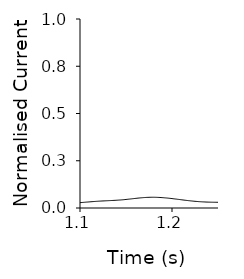
| Category | No Ammonium pH 8 in pH 5 out |
|---|---|
| 0.0 | 0.031 |
| 0.001 | 0.031 |
| 0.002 | 0.031 |
| 0.003 | 0.031 |
| 0.004 | 0.032 |
| 0.005 | 0.032 |
| 0.006 | 0.032 |
| 0.007 | 0.033 |
| 0.008 | 0.034 |
| 0.009 | 0.034 |
| 0.01 | 0.035 |
| 0.011 | 0.036 |
| 0.012 | 0.037 |
| 0.013 | 0.039 |
| 0.014 | 0.04 |
| 0.015 | 0.041 |
| 0.016 | 0.043 |
| 0.017 | 0.045 |
| 0.018 | 0.047 |
| 0.019 | 0.049 |
| 0.02 | 0.052 |
| 0.021 | 0.055 |
| 0.022 | 0.059 |
| 0.023 | 0.063 |
| 0.024 | 0.067 |
| 0.025 | 0.072 |
| 0.026 | 0.077 |
| 0.027 | 0.083 |
| 0.028 | 0.089 |
| 0.029 | 0.095 |
| 0.03 | 0.103 |
| 0.031 | 0.11 |
| 0.032 | 0.118 |
| 0.033 | 0.126 |
| 0.034 | 0.135 |
| 0.035 | 0.144 |
| 0.036 | 0.154 |
| 0.037 | 0.164 |
| 0.038 | 0.175 |
| 0.039 | 0.186 |
| 0.04 | 0.197 |
| 0.041 | 0.209 |
| 0.042 | 0.221 |
| 0.043 | 0.233 |
| 0.044 | 0.246 |
| 0.045 | 0.259 |
| 0.046 | 0.272 |
| 0.047 | 0.286 |
| 0.048 | 0.3 |
| 0.049 | 0.314 |
| 0.05 | 0.328 |
| 0.051 | 0.342 |
| 0.052 | 0.356 |
| 0.053 | 0.371 |
| 0.054 | 0.385 |
| 0.055 | 0.399 |
| 0.056 | 0.413 |
| 0.057 | 0.427 |
| 0.058 | 0.441 |
| 0.059 | 0.454 |
| 0.06 | 0.467 |
| 0.061 | 0.48 |
| 0.062 | 0.492 |
| 0.063 | 0.504 |
| 0.064 | 0.515 |
| 0.065 | 0.526 |
| 0.066 | 0.536 |
| 0.067 | 0.546 |
| 0.068 | 0.555 |
| 0.069 | 0.564 |
| 0.07 | 0.572 |
| 0.071 | 0.579 |
| 0.072 | 0.586 |
| 0.073 | 0.592 |
| 0.074 | 0.597 |
| 0.075 | 0.602 |
| 0.076 | 0.606 |
| 0.077 | 0.609 |
| 0.078 | 0.611 |
| 0.079 | 0.613 |
| 0.08 | 0.614 |
| 0.081 | 0.615 |
| 0.082 | 0.614 |
| 0.083 | 0.613 |
| 0.084 | 0.611 |
| 0.085 | 0.609 |
| 0.086 | 0.606 |
| 0.087 | 0.603 |
| 0.088 | 0.598 |
| 0.089 | 0.594 |
| 0.09 | 0.588 |
| 0.091 | 0.582 |
| 0.092 | 0.576 |
| 0.093 | 0.569 |
| 0.094 | 0.562 |
| 0.095 | 0.554 |
| 0.096 | 0.546 |
| 0.097 | 0.537 |
| 0.098 | 0.528 |
| 0.099 | 0.519 |
| 0.1 | 0.509 |
| 0.101 | 0.499 |
| 0.102 | 0.489 |
| 0.103 | 0.479 |
| 0.104 | 0.468 |
| 0.105 | 0.458 |
| 0.106 | 0.447 |
| 0.107 | 0.436 |
| 0.108 | 0.425 |
| 0.109 | 0.414 |
| 0.11 | 0.403 |
| 0.111 | 0.391 |
| 0.112 | 0.38 |
| 0.113 | 0.369 |
| 0.114 | 0.358 |
| 0.115 | 0.347 |
| 0.116 | 0.335 |
| 0.117 | 0.324 |
| 0.118 | 0.314 |
| 0.119 | 0.303 |
| 0.12 | 0.292 |
| 0.121 | 0.282 |
| 0.122 | 0.271 |
| 0.123 | 0.261 |
| 0.124 | 0.251 |
| 0.125 | 0.241 |
| 0.126 | 0.232 |
| 0.127 | 0.222 |
| 0.128 | 0.213 |
| 0.129 | 0.204 |
| 0.13 | 0.195 |
| 0.131 | 0.187 |
| 0.132 | 0.178 |
| 0.133 | 0.17 |
| 0.134 | 0.162 |
| 0.135 | 0.155 |
| 0.136 | 0.147 |
| 0.137 | 0.14 |
| 0.138 | 0.133 |
| 0.139 | 0.127 |
| 0.14 | 0.12 |
| 0.141 | 0.114 |
| 0.142 | 0.108 |
| 0.143 | 0.103 |
| 0.144 | 0.097 |
| 0.145 | 0.092 |
| 0.146 | 0.087 |
| 0.147 | 0.082 |
| 0.148 | 0.078 |
| 0.149 | 0.073 |
| 0.15 | 0.069 |
| 0.151 | 0.065 |
| 0.152 | 0.061 |
| 0.153 | 0.058 |
| 0.154 | 0.055 |
| 0.155 | 0.051 |
| 0.156 | 0.048 |
| 0.157 | 0.046 |
| 0.158 | 0.043 |
| 0.159 | 0.04 |
| 0.16 | 0.038 |
| 0.161 | 0.036 |
| 0.162 | 0.034 |
| 0.163 | 0.032 |
| 0.164 | 0.03 |
| 0.165 | 0.028 |
| 0.166 | 0.027 |
| 0.167 | 0.025 |
| 0.168 | 0.024 |
| 0.169 | 0.022 |
| 0.17 | 0.021 |
| 0.171 | 0.02 |
| 0.172 | 0.019 |
| 0.173 | 0.018 |
| 0.174 | 0.017 |
| 0.175 | 0.016 |
| 0.176 | 0.015 |
| 0.177 | 0.015 |
| 0.178 | 0.014 |
| 0.179 | 0.013 |
| 0.18 | 0.013 |
| 0.181 | 0.012 |
| 0.182 | 0.012 |
| 0.183 | 0.011 |
| 0.184 | 0.011 |
| 0.185 | 0.01 |
| 0.186 | 0.01 |
| 0.187 | 0.009 |
| 0.188 | 0.009 |
| 0.189 | 0.009 |
| 0.19 | 0.008 |
| 0.191 | 0.008 |
| 0.192 | 0.008 |
| 0.193 | 0.007 |
| 0.194 | 0.007 |
| 0.195 | 0.007 |
| 0.196 | 0.006 |
| 0.197 | 0.006 |
| 0.198 | 0.006 |
| 0.199 | 0.006 |
| 0.2 | 0.005 |
| 0.201 | 0.005 |
| 0.202 | 0.005 |
| 0.203 | 0.005 |
| 0.204 | 0.004 |
| 0.205 | 0.004 |
| 0.206 | 0.004 |
| 0.207 | 0.004 |
| 0.208 | 0.003 |
| 0.209 | 0.003 |
| 0.21 | 0.003 |
| 0.211 | 0.003 |
| 0.212 | 0.003 |
| 0.213 | 0.003 |
| 0.214 | 0.002 |
| 0.215 | 0.002 |
| 0.216 | 0.002 |
| 0.217 | 0.002 |
| 0.218 | 0.002 |
| 0.219 | 0.002 |
| 0.22 | 0.001 |
| 0.221 | 0.001 |
| 0.222 | 0.001 |
| 0.223 | 0.001 |
| 0.224 | 0.001 |
| 0.225 | 0.001 |
| 0.226 | 0.001 |
| 0.227 | 0.001 |
| 0.228 | 0.001 |
| 0.229 | 0.001 |
| 0.23 | 0.001 |
| 0.231 | 0.001 |
| 0.232 | 0.001 |
| 0.233 | 0 |
| 0.234 | 0 |
| 0.235 | 0 |
| 0.236 | 0 |
| 0.237 | 0 |
| 0.238 | 0.001 |
| 0.239 | 0.001 |
| 0.24 | 0.001 |
| 0.241 | 0.001 |
| 0.242 | 0.001 |
| 0.243 | 0.001 |
| 0.244 | 0.001 |
| 0.245 | 0.001 |
| 0.246 | 0.001 |
| 0.247 | 0.001 |
| 0.248 | 0.001 |
| 0.249 | 0.001 |
| 0.25 | 0.001 |
| 0.251 | 0.001 |
| 0.252 | 0.001 |
| 0.253 | 0.001 |
| 0.254 | 0.001 |
| 0.255 | 0.001 |
| 0.256 | 0.001 |
| 0.257 | 0.001 |
| 0.258 | 0.001 |
| 0.259 | 0.001 |
| 0.26 | 0.001 |
| 0.261 | 0.001 |
| 0.262 | 0.001 |
| 0.263 | 0.001 |
| 0.264 | 0.001 |
| 0.265 | 0.001 |
| 0.266 | 0.001 |
| 0.267 | 0.001 |
| 0.268 | 0.001 |
| 0.269 | 0.001 |
| 0.27 | 0.001 |
| 0.271 | 0.001 |
| 0.272 | 0.001 |
| 0.273 | 0.001 |
| 0.274 | 0.001 |
| 0.275 | 0.001 |
| 0.276 | 0.001 |
| 0.277 | 0.001 |
| 0.278 | 0.001 |
| 0.279 | 0.001 |
| 0.28 | 0.001 |
| 0.281 | 0.001 |
| 0.282 | 0.001 |
| 0.283 | 0.001 |
| 0.284 | 0.001 |
| 0.285 | 0.001 |
| 0.286 | 0.001 |
| 0.287 | 0.001 |
| 0.288 | 0.001 |
| 0.289 | 0.001 |
| 0.29 | 0.001 |
| 0.291 | 0.001 |
| 0.292 | 0.001 |
| 0.293 | 0.001 |
| 0.294 | 0.001 |
| 0.295 | 0.001 |
| 0.296 | 0.001 |
| 0.297 | 0.001 |
| 0.298 | 0.001 |
| 0.299 | 0.001 |
| 0.3 | 0.002 |
| 0.301 | 0.002 |
| 0.302 | 0.002 |
| 0.303 | 0.002 |
| 0.304 | 0.002 |
| 0.305 | 0.002 |
| 0.306 | 0.002 |
| 0.307 | 0.003 |
| 0.308 | 0.003 |
| 0.309 | 0.003 |
| 0.31 | 0.003 |
| 0.311 | 0.003 |
| 0.312 | 0.003 |
| 0.313 | 0.003 |
| 0.314 | 0.002 |
| 0.315 | 0.002 |
| 0.316 | 0 |
| 0.317 | -0.003 |
| 0.318 | -0.006 |
| 0.319 | -0.012 |
| 0.32 | -0.019 |
| 0.321 | -0.031 |
| 0.322 | -0.046 |
| 0.323 | -0.067 |
| 0.324 | -0.093 |
| 0.325 | -0.124 |
| 0.326 | -0.161 |
| 0.327 | -0.203 |
| 0.328 | -0.249 |
| 0.329 | -0.3 |
| 0.33 | -0.355 |
| 0.331 | -0.413 |
| 0.332 | -0.474 |
| 0.333 | -0.537 |
| 0.334 | -0.602 |
| 0.335 | -0.669 |
| 0.336 | -0.737 |
| 0.337 | -0.805 |
| 0.338 | -0.873 |
| 0.339 | -0.941 |
| 0.34 | -1.008 |
| 0.341 | -1.074 |
| 0.342 | -1.138 |
| 0.343 | -1.201 |
| 0.344 | -1.261 |
| 0.345 | -1.319 |
| 0.346 | -1.374 |
| 0.347 | -1.426 |
| 0.348 | -1.475 |
| 0.349 | -1.52 |
| 0.35 | -1.562 |
| 0.351 | -1.6 |
| 0.352 | -1.633 |
| 0.353 | -1.663 |
| 0.354 | -1.688 |
| 0.355 | -1.708 |
| 0.356 | -1.724 |
| 0.357 | -1.736 |
| 0.358 | -1.743 |
| 0.359 | -1.745 |
| 0.36 | -1.743 |
| 0.361 | -1.736 |
| 0.362 | -1.726 |
| 0.363 | -1.711 |
| 0.364 | -1.693 |
| 0.365 | -1.67 |
| 0.366 | -1.645 |
| 0.367 | -1.616 |
| 0.368 | -1.583 |
| 0.369 | -1.548 |
| 0.37 | -1.511 |
| 0.371 | -1.47 |
| 0.372 | -1.428 |
| 0.373 | -1.384 |
| 0.374 | -1.338 |
| 0.375 | -1.291 |
| 0.376 | -1.242 |
| 0.377 | -1.192 |
| 0.378 | -1.142 |
| 0.379 | -1.091 |
| 0.38 | -1.04 |
| 0.381 | -0.988 |
| 0.382 | -0.936 |
| 0.383 | -0.885 |
| 0.384 | -0.834 |
| 0.385 | -0.783 |
| 0.386 | -0.732 |
| 0.387 | -0.683 |
| 0.388 | -0.634 |
| 0.389 | -0.586 |
| 0.39 | -0.539 |
| 0.391 | -0.493 |
| 0.392 | -0.448 |
| 0.393 | -0.405 |
| 0.394 | -0.363 |
| 0.395 | -0.323 |
| 0.396 | -0.284 |
| 0.397 | -0.246 |
| 0.398 | -0.21 |
| 0.399 | -0.176 |
| 0.4 | -0.143 |
| 0.401 | -0.112 |
| 0.402 | -0.082 |
| 0.403 | -0.054 |
| 0.404 | -0.028 |
| 0.405 | -0.004 |
| 0.406 | 0.019 |
| 0.407 | 0.04 |
| 0.408 | 0.059 |
| 0.409 | 0.077 |
| 0.41 | 0.093 |
| 0.411 | 0.108 |
| 0.412 | 0.122 |
| 0.413 | 0.134 |
| 0.414 | 0.144 |
| 0.415 | 0.154 |
| 0.416 | 0.162 |
| 0.417 | 0.169 |
| 0.418 | 0.176 |
| 0.419 | 0.181 |
| 0.42 | 0.185 |
| 0.421 | 0.189 |
| 0.422 | 0.191 |
| 0.423 | 0.193 |
| 0.424 | 0.194 |
| 0.425 | 0.195 |
| 0.426 | 0.195 |
| 0.427 | 0.194 |
| 0.428 | 0.193 |
| 0.429 | 0.192 |
| 0.43 | 0.19 |
| 0.431 | 0.188 |
| 0.432 | 0.185 |
| 0.433 | 0.183 |
| 0.434 | 0.18 |
| 0.435 | 0.177 |
| 0.436 | 0.175 |
| 0.437 | 0.172 |
| 0.438 | 0.169 |
| 0.439 | 0.167 |
| 0.44 | 0.165 |
| 0.441 | 0.163 |
| 0.442 | 0.161 |
| 0.443 | 0.159 |
| 0.444 | 0.158 |
| 0.445 | 0.157 |
| 0.446 | 0.156 |
| 0.447 | 0.155 |
| 0.448 | 0.154 |
| 0.449 | 0.154 |
| 0.45 | 0.154 |
| 0.451 | 0.154 |
| 0.452 | 0.154 |
| 0.453 | 0.154 |
| 0.454 | 0.155 |
| 0.455 | 0.155 |
| 0.456 | 0.156 |
| 0.457 | 0.157 |
| 0.458 | 0.158 |
| 0.459 | 0.159 |
| 0.46 | 0.16 |
| 0.461 | 0.162 |
| 0.462 | 0.163 |
| 0.463 | 0.164 |
| 0.464 | 0.165 |
| 0.465 | 0.166 |
| 0.466 | 0.167 |
| 0.467 | 0.169 |
| 0.468 | 0.17 |
| 0.469 | 0.171 |
| 0.47 | 0.172 |
| 0.471 | 0.173 |
| 0.472 | 0.174 |
| 0.473 | 0.175 |
| 0.474 | 0.176 |
| 0.475 | 0.177 |
| 0.476 | 0.178 |
| 0.477 | 0.179 |
| 0.478 | 0.18 |
| 0.479 | 0.181 |
| 0.48 | 0.182 |
| 0.481 | 0.184 |
| 0.482 | 0.185 |
| 0.483 | 0.186 |
| 0.484 | 0.187 |
| 0.485 | 0.189 |
| 0.486 | 0.19 |
| 0.487 | 0.191 |
| 0.488 | 0.192 |
| 0.489 | 0.194 |
| 0.49 | 0.195 |
| 0.491 | 0.196 |
| 0.492 | 0.198 |
| 0.493 | 0.199 |
| 0.494 | 0.2 |
| 0.495 | 0.201 |
| 0.496 | 0.202 |
| 0.497 | 0.203 |
| 0.498 | 0.204 |
| 0.499 | 0.205 |
| 0.5 | 0.206 |
| 0.501 | 0.207 |
| 0.502 | 0.208 |
| 0.503 | 0.208 |
| 0.504 | 0.209 |
| 0.505 | 0.21 |
| 0.506 | 0.21 |
| 0.507 | 0.211 |
| 0.508 | 0.211 |
| 0.509 | 0.211 |
| 0.51 | 0.211 |
| 0.511 | 0.212 |
| 0.512 | 0.212 |
| 0.513 | 0.212 |
| 0.514 | 0.212 |
| 0.515 | 0.212 |
| 0.516 | 0.212 |
| 0.517 | 0.211 |
| 0.518 | 0.211 |
| 0.519 | 0.211 |
| 0.52 | 0.211 |
| 0.521 | 0.21 |
| 0.522 | 0.21 |
| 0.523 | 0.209 |
| 0.524 | 0.209 |
| 0.525 | 0.208 |
| 0.526 | 0.208 |
| 0.527 | 0.207 |
| 0.528 | 0.206 |
| 0.529 | 0.206 |
| 0.53 | 0.205 |
| 0.531 | 0.204 |
| 0.532 | 0.203 |
| 0.533 | 0.203 |
| 0.534 | 0.202 |
| 0.535 | 0.201 |
| 0.536 | 0.2 |
| 0.537 | 0.199 |
| 0.538 | 0.198 |
| 0.539 | 0.197 |
| 0.54 | 0.196 |
| 0.541 | 0.195 |
| 0.542 | 0.194 |
| 0.543 | 0.193 |
| 0.544 | 0.192 |
| 0.545 | 0.191 |
| 0.546 | 0.19 |
| 0.547 | 0.189 |
| 0.548 | 0.188 |
| 0.549 | 0.187 |
| 0.55 | 0.185 |
| 0.551 | 0.184 |
| 0.552 | 0.183 |
| 0.553 | 0.182 |
| 0.554 | 0.181 |
| 0.555 | 0.18 |
| 0.556 | 0.179 |
| 0.557 | 0.178 |
| 0.558 | 0.177 |
| 0.559 | 0.176 |
| 0.56 | 0.175 |
| 0.561 | 0.174 |
| 0.562 | 0.173 |
| 0.563 | 0.172 |
| 0.564 | 0.171 |
| 0.565 | 0.17 |
| 0.566 | 0.17 |
| 0.567 | 0.169 |
| 0.568 | 0.168 |
| 0.569 | 0.167 |
| 0.57 | 0.166 |
| 0.571 | 0.165 |
| 0.572 | 0.165 |
| 0.573 | 0.164 |
| 0.574 | 0.163 |
| 0.575 | 0.162 |
| 0.576 | 0.162 |
| 0.577 | 0.161 |
| 0.578 | 0.16 |
| 0.579 | 0.159 |
| 0.58 | 0.159 |
| 0.581 | 0.158 |
| 0.582 | 0.157 |
| 0.583 | 0.157 |
| 0.584 | 0.156 |
| 0.585 | 0.155 |
| 0.586 | 0.155 |
| 0.587 | 0.154 |
| 0.588 | 0.153 |
| 0.589 | 0.153 |
| 0.59 | 0.152 |
| 0.591 | 0.151 |
| 0.592 | 0.151 |
| 0.593 | 0.15 |
| 0.594 | 0.149 |
| 0.595 | 0.149 |
| 0.596 | 0.148 |
| 0.597 | 0.147 |
| 0.598 | 0.147 |
| 0.599 | 0.146 |
| 0.6 | 0.145 |
| 0.601 | 0.145 |
| 0.602 | 0.144 |
| 0.603 | 0.143 |
| 0.604 | 0.143 |
| 0.605 | 0.142 |
| 0.606 | 0.141 |
| 0.607 | 0.141 |
| 0.608 | 0.14 |
| 0.609 | 0.139 |
| 0.61 | 0.138 |
| 0.611 | 0.138 |
| 0.612 | 0.137 |
| 0.613 | 0.136 |
| 0.614 | 0.135 |
| 0.615 | 0.135 |
| 0.616 | 0.134 |
| 0.617 | 0.133 |
| 0.618 | 0.132 |
| 0.619 | 0.131 |
| 0.62 | 0.131 |
| 0.621 | 0.13 |
| 0.622 | 0.129 |
| 0.623 | 0.128 |
| 0.624 | 0.127 |
| 0.625 | 0.126 |
| 0.626 | 0.126 |
| 0.627 | 0.125 |
| 0.628 | 0.124 |
| 0.629 | 0.123 |
| 0.63 | 0.122 |
| 0.631 | 0.121 |
| 0.632 | 0.121 |
| 0.633 | 0.12 |
| 0.634 | 0.119 |
| 0.635 | 0.118 |
| 0.636 | 0.117 |
| 0.637 | 0.116 |
| 0.638 | 0.115 |
| 0.639 | 0.115 |
| 0.64 | 0.114 |
| 0.641 | 0.113 |
| 0.642 | 0.112 |
| 0.643 | 0.111 |
| 0.644 | 0.11 |
| 0.645 | 0.11 |
| 0.646 | 0.109 |
| 0.647 | 0.108 |
| 0.648 | 0.107 |
| 0.649 | 0.106 |
| 0.65 | 0.106 |
| 0.651 | 0.105 |
| 0.652 | 0.104 |
| 0.653 | 0.103 |
| 0.654 | 0.102 |
| 0.655 | 0.102 |
| 0.656 | 0.101 |
| 0.657 | 0.1 |
| 0.658 | 0.099 |
| 0.659 | 0.099 |
| 0.66 | 0.098 |
| 0.661 | 0.097 |
| 0.662 | 0.096 |
| 0.663 | 0.096 |
| 0.664 | 0.095 |
| 0.665 | 0.094 |
| 0.666 | 0.094 |
| 0.667 | 0.093 |
| 0.668 | 0.092 |
| 0.669 | 0.092 |
| 0.67 | 0.091 |
| 0.671 | 0.09 |
| 0.672 | 0.09 |
| 0.673 | 0.089 |
| 0.674 | 0.089 |
| 0.675 | 0.088 |
| 0.676 | 0.088 |
| 0.677 | 0.087 |
| 0.678 | 0.086 |
| 0.679 | 0.086 |
| 0.68 | 0.085 |
| 0.681 | 0.085 |
| 0.682 | 0.084 |
| 0.683 | 0.084 |
| 0.684 | 0.084 |
| 0.685 | 0.083 |
| 0.686 | 0.083 |
| 0.687 | 0.082 |
| 0.688 | 0.082 |
| 0.689 | 0.081 |
| 0.69 | 0.081 |
| 0.691 | 0.081 |
| 0.692 | 0.08 |
| 0.693 | 0.08 |
| 0.694 | 0.079 |
| 0.695 | 0.079 |
| 0.696 | 0.079 |
| 0.697 | 0.078 |
| 0.698 | 0.078 |
| 0.699 | 0.078 |
| 0.7 | 0.077 |
| 0.701 | 0.077 |
| 0.702 | 0.076 |
| 0.703 | 0.076 |
| 0.704 | 0.076 |
| 0.705 | 0.075 |
| 0.706 | 0.075 |
| 0.707 | 0.074 |
| 0.708 | 0.074 |
| 0.709 | 0.074 |
| 0.71 | 0.073 |
| 0.711 | 0.073 |
| 0.712 | 0.072 |
| 0.713 | 0.072 |
| 0.714 | 0.071 |
| 0.715 | 0.071 |
| 0.716 | 0.07 |
| 0.717 | 0.07 |
| 0.718 | 0.069 |
| 0.719 | 0.069 |
| 0.72 | 0.068 |
| 0.721 | 0.068 |
| 0.722 | 0.067 |
| 0.723 | 0.067 |
| 0.724 | 0.066 |
| 0.725 | 0.066 |
| 0.726 | 0.065 |
| 0.727 | 0.064 |
| 0.728 | 0.064 |
| 0.729 | 0.063 |
| 0.73 | 0.063 |
| 0.731 | 0.062 |
| 0.732 | 0.062 |
| 0.733 | 0.061 |
| 0.734 | 0.06 |
| 0.735 | 0.06 |
| 0.736 | 0.059 |
| 0.737 | 0.059 |
| 0.738 | 0.058 |
| 0.739 | 0.057 |
| 0.74 | 0.057 |
| 0.741 | 0.056 |
| 0.742 | 0.055 |
| 0.743 | 0.055 |
| 0.744 | 0.054 |
| 0.745 | 0.054 |
| 0.746 | 0.053 |
| 0.747 | 0.052 |
| 0.748 | 0.052 |
| 0.749 | 0.051 |
| 0.75 | 0.05 |
| 0.751 | 0.05 |
| 0.752 | 0.049 |
| 0.753 | 0.049 |
| 0.754 | 0.048 |
| 0.755 | 0.047 |
| 0.756 | 0.047 |
| 0.757 | 0.046 |
| 0.758 | 0.046 |
| 0.759 | 0.045 |
| 0.76 | 0.045 |
| 0.761 | 0.044 |
| 0.762 | 0.044 |
| 0.763 | 0.043 |
| 0.764 | 0.043 |
| 0.765 | 0.042 |
| 0.766 | 0.042 |
| 0.767 | 0.041 |
| 0.768 | 0.041 |
| 0.769 | 0.04 |
| 0.77 | 0.04 |
| 0.771 | 0.039 |
| 0.772 | 0.039 |
| 0.773 | 0.038 |
| 0.774 | 0.038 |
| 0.775 | 0.037 |
| 0.776 | 0.037 |
| 0.777 | 0.037 |
| 0.778 | 0.036 |
| 0.779 | 0.036 |
| 0.78 | 0.035 |
| 0.781 | 0.035 |
| 0.782 | 0.035 |
| 0.783 | 0.034 |
| 0.784 | 0.034 |
| 0.785 | 0.034 |
| 0.786 | 0.033 |
| 0.787 | 0.033 |
| 0.788 | 0.033 |
| 0.789 | 0.032 |
| 0.79 | 0.032 |
| 0.791 | 0.032 |
| 0.792 | 0.031 |
| 0.793 | 0.031 |
| 0.794 | 0.031 |
| 0.795 | 0.03 |
| 0.796 | 0.03 |
| 0.797 | 0.03 |
| 0.798 | 0.03 |
| 0.799 | 0.029 |
| 0.8 | 0.029 |
| 0.801 | 0.029 |
| 0.802 | 0.029 |
| 0.803 | 0.028 |
| 0.804 | 0.028 |
| 0.805 | 0.028 |
| 0.806 | 0.028 |
| 0.807 | 0.028 |
| 0.808 | 0.027 |
| 0.809 | 0.027 |
| 0.81 | 0.027 |
| 0.811 | 0.027 |
| 0.812 | 0.027 |
| 0.813 | 0.027 |
| 0.814 | 0.026 |
| 0.815 | 0.026 |
| 0.816 | 0.026 |
| 0.817 | 0.026 |
| 0.818 | 0.026 |
| 0.819 | 0.026 |
| 0.82 | 0.026 |
| 0.821 | 0.025 |
| 0.822 | 0.025 |
| 0.823 | 0.025 |
| 0.824 | 0.025 |
| 0.825 | 0.025 |
| 0.826 | 0.025 |
| 0.827 | 0.025 |
| 0.828 | 0.025 |
| 0.829 | 0.025 |
| 0.83 | 0.024 |
| 0.831 | 0.024 |
| 0.832 | 0.024 |
| 0.833 | 0.024 |
| 0.834 | 0.024 |
| 0.835 | 0.024 |
| 0.836 | 0.024 |
| 0.837 | 0.024 |
| 0.838 | 0.024 |
| 0.839 | 0.024 |
| 0.84 | 0.024 |
| 0.841 | 0.024 |
| 0.842 | 0.024 |
| 0.843 | 0.024 |
| 0.844 | 0.024 |
| 0.845 | 0.024 |
| 0.846 | 0.024 |
| 0.847 | 0.024 |
| 0.848 | 0.024 |
| 0.849 | 0.023 |
| 0.85 | 0.023 |
| 0.851 | 0.023 |
| 0.852 | 0.023 |
| 0.853 | 0.023 |
| 0.854 | 0.023 |
| 0.855 | 0.023 |
| 0.856 | 0.023 |
| 0.857 | 0.023 |
| 0.858 | 0.023 |
| 0.859 | 0.023 |
| 0.86 | 0.023 |
| 0.861 | 0.023 |
| 0.862 | 0.023 |
| 0.863 | 0.023 |
| 0.864 | 0.023 |
| 0.865 | 0.023 |
| 0.866 | 0.023 |
| 0.867 | 0.023 |
| 0.868 | 0.023 |
| 0.869 | 0.023 |
| 0.87 | 0.023 |
| 0.871 | 0.023 |
| 0.872 | 0.023 |
| 0.873 | 0.023 |
| 0.874 | 0.023 |
| 0.875 | 0.023 |
| 0.876 | 0.023 |
| 0.877 | 0.023 |
| 0.878 | 0.023 |
| 0.879 | 0.023 |
| 0.88 | 0.023 |
| 0.881 | 0.023 |
| 0.882 | 0.023 |
| 0.883 | 0.023 |
| 0.884 | 0.023 |
| 0.885 | 0.023 |
| 0.886 | 0.023 |
| 0.887 | 0.023 |
| 0.888 | 0.023 |
| 0.889 | 0.023 |
| 0.89 | 0.024 |
| 0.891 | 0.024 |
| 0.892 | 0.024 |
| 0.893 | 0.024 |
| 0.894 | 0.024 |
| 0.895 | 0.024 |
| 0.896 | 0.024 |
| 0.897 | 0.024 |
| 0.898 | 0.024 |
| 0.899 | 0.024 |
| 0.9 | 0.024 |
| 0.901 | 0.024 |
| 0.902 | 0.025 |
| 0.903 | 0.025 |
| 0.904 | 0.025 |
| 0.905 | 0.025 |
| 0.906 | 0.025 |
| 0.907 | 0.025 |
| 0.908 | 0.025 |
| 0.909 | 0.025 |
| 0.91 | 0.025 |
| 0.911 | 0.025 |
| 0.912 | 0.025 |
| 0.913 | 0.025 |
| 0.914 | 0.025 |
| 0.915 | 0.026 |
| 0.916 | 0.026 |
| 0.917 | 0.026 |
| 0.918 | 0.026 |
| 0.919 | 0.026 |
| 0.92 | 0.026 |
| 0.921 | 0.026 |
| 0.922 | 0.026 |
| 0.923 | 0.026 |
| 0.924 | 0.026 |
| 0.925 | 0.026 |
| 0.926 | 0.026 |
| 0.927 | 0.026 |
| 0.928 | 0.026 |
| 0.929 | 0.026 |
| 0.93 | 0.026 |
| 0.931 | 0.026 |
| 0.932 | 0.026 |
| 0.933 | 0.026 |
| 0.934 | 0.026 |
| 0.935 | 0.026 |
| 0.936 | 0.026 |
| 0.937 | 0.026 |
| 0.938 | 0.026 |
| 0.939 | 0.026 |
| 0.94 | 0.026 |
| 0.941 | 0.026 |
| 0.942 | 0.026 |
| 0.943 | 0.026 |
| 0.944 | 0.026 |
| 0.945 | 0.026 |
| 0.946 | 0.026 |
| 0.947 | 0.026 |
| 0.948 | 0.026 |
| 0.949 | 0.026 |
| 0.95 | 0.026 |
| 0.951 | 0.026 |
| 0.952 | 0.026 |
| 0.953 | 0.026 |
| 0.954 | 0.026 |
| 0.955 | 0.026 |
| 0.956 | 0.026 |
| 0.957 | 0.026 |
| 0.958 | 0.026 |
| 0.959 | 0.025 |
| 0.96 | 0.025 |
| 0.961 | 0.025 |
| 0.962 | 0.025 |
| 0.963 | 0.025 |
| 0.964 | 0.025 |
| 0.965 | 0.025 |
| 0.966 | 0.025 |
| 0.967 | 0.025 |
| 0.968 | 0.025 |
| 0.969 | 0.024 |
| 0.97 | 0.024 |
| 0.971 | 0.024 |
| 0.972 | 0.024 |
| 0.973 | 0.024 |
| 0.974 | 0.024 |
| 0.975 | 0.024 |
| 0.976 | 0.024 |
| 0.977 | 0.023 |
| 0.978 | 0.023 |
| 0.979 | 0.023 |
| 0.98 | 0.023 |
| 0.981 | 0.023 |
| 0.982 | 0.023 |
| 0.983 | 0.023 |
| 0.984 | 0.023 |
| 0.985 | 0.022 |
| 0.986 | 0.022 |
| 0.987 | 0.022 |
| 0.988 | 0.022 |
| 0.989 | 0.022 |
| 0.99 | 0.022 |
| 0.991 | 0.022 |
| 0.992 | 0.021 |
| 0.993 | 0.021 |
| 0.994 | 0.021 |
| 0.995 | 0.021 |
| 0.996 | 0.021 |
| 0.997 | 0.021 |
| 0.998 | 0.021 |
| 0.999 | 0.021 |
| 1.0 | 0.021 |
| 1.001 | 0.02 |
| 1.002 | 0.02 |
| 1.003 | 0.02 |
| 1.004 | 0.02 |
| 1.005 | 0.02 |
| 1.006 | 0.02 |
| 1.007 | 0.02 |
| 1.008 | 0.02 |
| 1.009 | 0.019 |
| 1.01 | 0.019 |
| 1.011 | 0.019 |
| 1.012 | 0.019 |
| 1.013 | 0.019 |
| 1.014 | 0.019 |
| 1.015 | 0.019 |
| 1.016 | 0.019 |
| 1.017 | 0.018 |
| 1.018 | 0.018 |
| 1.019 | 0.018 |
| 1.02 | 0.018 |
| 1.021 | 0.018 |
| 1.022 | 0.018 |
| 1.023 | 0.018 |
| 1.024 | 0.018 |
| 1.025 | 0.018 |
| 1.026 | 0.018 |
| 1.027 | 0.018 |
| 1.028 | 0.018 |
| 1.029 | 0.018 |
| 1.03 | 0.018 |
| 1.031 | 0.018 |
| 1.032 | 0.018 |
| 1.033 | 0.018 |
| 1.034 | 0.018 |
| 1.035 | 0.018 |
| 1.036 | 0.018 |
| 1.037 | 0.018 |
| 1.038 | 0.018 |
| 1.039 | 0.018 |
| 1.04 | 0.018 |
| 1.041 | 0.018 |
| 1.042 | 0.018 |
| 1.043 | 0.018 |
| 1.044 | 0.018 |
| 1.045 | 0.019 |
| 1.046 | 0.019 |
| 1.047 | 0.019 |
| 1.048 | 0.019 |
| 1.049 | 0.019 |
| 1.05 | 0.019 |
| 1.051 | 0.019 |
| 1.052 | 0.019 |
| 1.053 | 0.019 |
| 1.054 | 0.019 |
| 1.055 | 0.019 |
| 1.056 | 0.019 |
| 1.057 | 0.019 |
| 1.058 | 0.019 |
| 1.059 | 0.02 |
| 1.06 | 0.02 |
| 1.061 | 0.02 |
| 1.062 | 0.02 |
| 1.063 | 0.02 |
| 1.064 | 0.02 |
| 1.065 | 0.02 |
| 1.066 | 0.02 |
| 1.067 | 0.02 |
| 1.068 | 0.02 |
| 1.069 | 0.02 |
| 1.07 | 0.02 |
| 1.071 | 0.02 |
| 1.072 | 0.021 |
| 1.073 | 0.021 |
| 1.074 | 0.021 |
| 1.075 | 0.021 |
| 1.076 | 0.021 |
| 1.077 | 0.021 |
| 1.078 | 0.021 |
| 1.079 | 0.022 |
| 1.08 | 0.022 |
| 1.081 | 0.022 |
| 1.082 | 0.022 |
| 1.083 | 0.022 |
| 1.084 | 0.023 |
| 1.085 | 0.023 |
| 1.086 | 0.023 |
| 1.087 | 0.023 |
| 1.088 | 0.024 |
| 1.089 | 0.024 |
| 1.09 | 0.024 |
| 1.091 | 0.025 |
| 1.092 | 0.025 |
| 1.093 | 0.025 |
| 1.094 | 0.026 |
| 1.095 | 0.026 |
| 1.096 | 0.027 |
| 1.097 | 0.027 |
| 1.098 | 0.027 |
| 1.099 | 0.028 |
| 1.1 | 0.028 |
| 1.101 | 0.029 |
| 1.102 | 0.029 |
| 1.103 | 0.029 |
| 1.104 | 0.03 |
| 1.105 | 0.03 |
| 1.106 | 0.031 |
| 1.107 | 0.031 |
| 1.108 | 0.031 |
| 1.109 | 0.032 |
| 1.11 | 0.032 |
| 1.111 | 0.033 |
| 1.112 | 0.033 |
| 1.113 | 0.033 |
| 1.114 | 0.034 |
| 1.115 | 0.034 |
| 1.116 | 0.035 |
| 1.117 | 0.035 |
| 1.118 | 0.035 |
| 1.119 | 0.036 |
| 1.12 | 0.036 |
| 1.121 | 0.036 |
| 1.122 | 0.037 |
| 1.123 | 0.037 |
| 1.124 | 0.037 |
| 1.125 | 0.037 |
| 1.126 | 0.038 |
| 1.127 | 0.038 |
| 1.128 | 0.038 |
| 1.129 | 0.038 |
| 1.13 | 0.039 |
| 1.131 | 0.039 |
| 1.132 | 0.039 |
| 1.133 | 0.039 |
| 1.134 | 0.04 |
| 1.135 | 0.04 |
| 1.136 | 0.04 |
| 1.137 | 0.04 |
| 1.138 | 0.041 |
| 1.139 | 0.041 |
| 1.14 | 0.041 |
| 1.141 | 0.041 |
| 1.142 | 0.042 |
| 1.143 | 0.042 |
| 1.144 | 0.042 |
| 1.145 | 0.043 |
| 1.146 | 0.043 |
| 1.147 | 0.044 |
| 1.148 | 0.044 |
| 1.149 | 0.045 |
| 1.15 | 0.045 |
| 1.151 | 0.046 |
| 1.152 | 0.046 |
| 1.153 | 0.047 |
| 1.154 | 0.047 |
| 1.155 | 0.048 |
| 1.156 | 0.048 |
| 1.157 | 0.049 |
| 1.158 | 0.05 |
| 1.159 | 0.05 |
| 1.16 | 0.051 |
| 1.161 | 0.051 |
| 1.162 | 0.052 |
| 1.163 | 0.052 |
| 1.164 | 0.053 |
| 1.165 | 0.053 |
| 1.166 | 0.054 |
| 1.167 | 0.054 |
| 1.168 | 0.055 |
| 1.169 | 0.055 |
| 1.17 | 0.055 |
| 1.171 | 0.056 |
| 1.172 | 0.056 |
| 1.173 | 0.056 |
| 1.174 | 0.056 |
| 1.175 | 0.057 |
| 1.176 | 0.057 |
| 1.177 | 0.057 |
| 1.178 | 0.057 |
| 1.179 | 0.057 |
| 1.18 | 0.057 |
| 1.181 | 0.057 |
| 1.182 | 0.057 |
| 1.183 | 0.057 |
| 1.184 | 0.056 |
| 1.185 | 0.056 |
| 1.186 | 0.056 |
| 1.187 | 0.056 |
| 1.188 | 0.055 |
| 1.189 | 0.055 |
| 1.19 | 0.055 |
| 1.191 | 0.054 |
| 1.192 | 0.054 |
| 1.193 | 0.053 |
| 1.194 | 0.053 |
| 1.195 | 0.053 |
| 1.196 | 0.052 |
| 1.197 | 0.052 |
| 1.198 | 0.051 |
| 1.199 | 0.05 |
| 1.2 | 0.05 |
| 1.201 | 0.049 |
| 1.202 | 0.049 |
| 1.203 | 0.048 |
| 1.204 | 0.047 |
| 1.205 | 0.047 |
| 1.206 | 0.046 |
| 1.207 | 0.046 |
| 1.208 | 0.045 |
| 1.209 | 0.044 |
| 1.21 | 0.044 |
| 1.211 | 0.043 |
| 1.212 | 0.042 |
| 1.213 | 0.042 |
| 1.214 | 0.041 |
| 1.215 | 0.041 |
| 1.216 | 0.04 |
| 1.217 | 0.039 |
| 1.218 | 0.039 |
| 1.219 | 0.038 |
| 1.22 | 0.038 |
| 1.221 | 0.037 |
| 1.222 | 0.037 |
| 1.223 | 0.036 |
| 1.224 | 0.036 |
| 1.225 | 0.035 |
| 1.226 | 0.035 |
| 1.227 | 0.035 |
| 1.228 | 0.034 |
| 1.229 | 0.034 |
| 1.23 | 0.033 |
| 1.231 | 0.033 |
| 1.232 | 0.033 |
| 1.233 | 0.033 |
| 1.234 | 0.032 |
| 1.235 | 0.032 |
| 1.236 | 0.032 |
| 1.237 | 0.032 |
| 1.238 | 0.031 |
| 1.239 | 0.031 |
| 1.24 | 0.031 |
| 1.241 | 0.031 |
| 1.242 | 0.031 |
| 1.243 | 0.031 |
| 1.244 | 0.031 |
| 1.245 | 0.03 |
| 1.246 | 0.03 |
| 1.247 | 0.03 |
| 1.248 | 0.03 |
| 1.249 | 0.03 |
| 1.25 | 0.03 |
| 1.251 | 0.03 |
| 1.252 | 0.03 |
| 1.253 | 0.03 |
| 1.254 | 0.03 |
| 1.255 | 0.03 |
| 1.256 | 0.031 |
| 1.257 | 0.031 |
| 1.258 | 0.031 |
| 1.259 | 0.031 |
| 1.26 | 0.031 |
| 1.261 | 0.031 |
| 1.262 | 0.031 |
| 1.263 | 0.031 |
| 1.264 | 0.031 |
| 1.265 | 0.032 |
| 1.266 | 0.032 |
| 1.267 | 0.032 |
| 1.268 | 0.032 |
| 1.269 | 0.032 |
| 1.27 | 0.032 |
| 1.271 | 0.032 |
| 1.272 | 0.033 |
| 1.273 | 0.033 |
| 1.274 | 0.033 |
| 1.275 | 0.033 |
| 1.276 | 0.033 |
| 1.277 | 0.033 |
| 1.278 | 0.033 |
| 1.279 | 0.033 |
| 1.28 | 0.033 |
| 1.281 | 0.034 |
| 1.282 | 0.034 |
| 1.283 | 0.034 |
| 1.284 | 0.034 |
| 1.285 | 0.034 |
| 1.286 | 0.034 |
| 1.287 | 0.034 |
| 1.288 | 0.034 |
| 1.289 | 0.034 |
| 1.29 | 0.034 |
| 1.291 | 0.034 |
| 1.292 | 0.034 |
| 1.293 | 0.034 |
| 1.294 | 0.034 |
| 1.295 | 0.034 |
| 1.296 | 0.034 |
| 1.297 | 0.034 |
| 1.298 | 0.034 |
| 1.299 | 0.033 |
| 1.3 | 0.033 |
| 1.301 | 0.033 |
| 1.302 | 0.033 |
| 1.303 | 0.033 |
| 1.304 | 0.033 |
| 1.305 | 0.033 |
| 1.306 | 0.033 |
| 1.307 | 0.033 |
| 1.308 | 0.032 |
| 1.309 | 0.032 |
| 1.31 | 0.032 |
| 1.311 | 0.032 |
| 1.312 | 0.032 |
| 1.313 | 0.032 |
| 1.314 | 0.032 |
| 1.315 | 0.032 |
| 1.316 | 0.032 |
| 1.317 | 0.031 |
| 1.318 | 0.031 |
| 1.319 | 0.031 |
| 1.32 | 0.031 |
| 1.321 | 0.031 |
| 1.322 | 0.031 |
| 1.323 | 0.031 |
| 1.324 | 0.031 |
| 1.325 | 0.031 |
| 1.326 | 0.031 |
| 1.327 | 0.031 |
| 1.328 | 0.031 |
| 1.329 | 0.031 |
| 1.33 | 0.031 |
| 1.331 | 0.031 |
| 1.332 | 0.031 |
| 1.333 | 0.031 |
| 1.334 | 0.031 |
| 1.335 | 0.031 |
| 1.336 | 0.031 |
| 1.337 | 0.031 |
| 1.338 | 0.031 |
| 1.339 | 0.031 |
| 1.34 | 0.031 |
| 1.341 | 0.031 |
| 1.342 | 0.032 |
| 1.343 | 0.032 |
| 1.344 | 0.032 |
| 1.345 | 0.032 |
| 1.346 | 0.032 |
| 1.347 | 0.032 |
| 1.348 | 0.032 |
| 1.349 | 0.032 |
| 1.35 | 0.033 |
| 1.351 | 0.033 |
| 1.352 | 0.033 |
| 1.353 | 0.033 |
| 1.354 | 0.033 |
| 1.355 | 0.033 |
| 1.356 | 0.033 |
| 1.357 | 0.033 |
| 1.358 | 0.033 |
| 1.359 | 0.033 |
| 1.36 | 0.034 |
| 1.361 | 0.034 |
| 1.362 | 0.034 |
| 1.363 | 0.034 |
| 1.364 | 0.034 |
| 1.365 | 0.034 |
| 1.366 | 0.034 |
| 1.367 | 0.034 |
| 1.368 | 0.034 |
| 1.369 | 0.034 |
| 1.37 | 0.034 |
| 1.371 | 0.034 |
| 1.372 | 0.034 |
| 1.373 | 0.034 |
| 1.374 | 0.035 |
| 1.375 | 0.035 |
| 1.376 | 0.035 |
| 1.377 | 0.035 |
| 1.378 | 0.035 |
| 1.379 | 0.035 |
| 1.38 | 0.035 |
| 1.381 | 0.035 |
| 1.382 | 0.035 |
| 1.383 | 0.035 |
| 1.384 | 0.035 |
| 1.385 | 0.035 |
| 1.386 | 0.035 |
| 1.387 | 0.035 |
| 1.388 | 0.035 |
| 1.389 | 0.035 |
| 1.39 | 0.035 |
| 1.391 | 0.035 |
| 1.392 | 0.034 |
| 1.393 | 0.034 |
| 1.394 | 0.034 |
| 1.395 | 0.034 |
| 1.396 | 0.034 |
| 1.397 | 0.034 |
| 1.398 | 0.034 |
| 1.399 | 0.034 |
| 1.4 | 0.034 |
| 1.401 | 0.034 |
| 1.402 | 0.034 |
| 1.403 | 0.034 |
| 1.404 | 0.034 |
| 1.405 | 0.034 |
| 1.406 | 0.034 |
| 1.407 | 0.034 |
| 1.408 | 0.034 |
| 1.409 | 0.034 |
| 1.41 | 0.034 |
| 1.411 | 0.034 |
| 1.412 | 0.034 |
| 1.413 | 0.034 |
| 1.414 | 0.034 |
| 1.415 | 0.034 |
| 1.416 | 0.034 |
| 1.417 | 0.034 |
| 1.418 | 0.034 |
| 1.419 | 0.033 |
| 1.42 | 0.033 |
| 1.421 | 0.033 |
| 1.422 | 0.033 |
| 1.423 | 0.033 |
| 1.424 | 0.033 |
| 1.425 | 0.033 |
| 1.426 | 0.033 |
| 1.427 | 0.033 |
| 1.428 | 0.033 |
| 1.429 | 0.033 |
| 1.43 | 0.033 |
| 1.431 | 0.033 |
| 1.432 | 0.033 |
| 1.433 | 0.033 |
| 1.434 | 0.033 |
| 1.435 | 0.032 |
| 1.436 | 0.032 |
| 1.437 | 0.032 |
| 1.438 | 0.032 |
| 1.439 | 0.032 |
| 1.44 | 0.032 |
| 1.441 | 0.032 |
| 1.442 | 0.032 |
| 1.443 | 0.032 |
| 1.444 | 0.032 |
| 1.445 | 0.032 |
| 1.446 | 0.032 |
| 1.447 | 0.032 |
| 1.448 | 0.032 |
| 1.449 | 0.032 |
| 1.45 | 0.032 |
| 1.451 | 0.032 |
| 1.452 | 0.032 |
| 1.453 | 0.032 |
| 1.454 | 0.032 |
| 1.455 | 0.032 |
| 1.456 | 0.032 |
| 1.457 | 0.032 |
| 1.458 | 0.032 |
| 1.459 | 0.033 |
| 1.46 | 0.033 |
| 1.461 | 0.033 |
| 1.462 | 0.033 |
| 1.463 | 0.033 |
| 1.464 | 0.033 |
| 1.465 | 0.033 |
| 1.466 | 0.033 |
| 1.467 | 0.033 |
| 1.468 | 0.033 |
| 1.469 | 0.033 |
| 1.47 | 0.033 |
| 1.471 | 0.034 |
| 1.472 | 0.034 |
| 1.473 | 0.034 |
| 1.474 | 0.034 |
| 1.475 | 0.034 |
| 1.476 | 0.034 |
| 1.477 | 0.034 |
| 1.478 | 0.034 |
| 1.479 | 0.035 |
| 1.48 | 0.035 |
| 1.481 | 0.035 |
| 1.482 | 0.035 |
| 1.483 | 0.035 |
| 1.484 | 0.035 |
| 1.485 | 0.036 |
| 1.486 | 0.036 |
| 1.487 | 0.036 |
| 1.488 | 0.036 |
| 1.489 | 0.036 |
| 1.49 | 0.037 |
| 1.491 | 0.037 |
| 1.492 | 0.037 |
| 1.493 | 0.037 |
| 1.494 | 0.038 |
| 1.495 | 0.038 |
| 1.496 | 0.038 |
| 1.497 | 0.038 |
| 1.498 | 0.039 |
| 1.499 | 0.039 |
| 1.5 | 0.039 |
| 1.501 | 0.039 |
| 1.502 | 0.04 |
| 1.503 | 0.04 |
| 1.504 | 0.04 |
| 1.505 | 0.04 |
| 1.506 | 0.041 |
| 1.507 | 0.041 |
| 1.508 | 0.041 |
| 1.509 | 0.041 |
| 1.51 | 0.042 |
| 1.511 | 0.042 |
| 1.512 | 0.042 |
| 1.513 | 0.043 |
| 1.514 | 0.043 |
| 1.515 | 0.043 |
| 1.516 | 0.043 |
| 1.517 | 0.044 |
| 1.518 | 0.044 |
| 1.519 | 0.044 |
| 1.52 | 0.045 |
| 1.521 | 0.045 |
| 1.522 | 0.045 |
| 1.523 | 0.046 |
| 1.524 | 0.046 |
| 1.525 | 0.046 |
| 1.526 | 0.047 |
| 1.527 | 0.047 |
| 1.528 | 0.047 |
| 1.529 | 0.048 |
| 1.53 | 0.048 |
| 1.531 | 0.048 |
| 1.532 | 0.049 |
| 1.533 | 0.049 |
| 1.534 | 0.049 |
| 1.535 | 0.049 |
| 1.536 | 0.05 |
| 1.537 | 0.05 |
| 1.538 | 0.05 |
| 1.539 | 0.05 |
| 1.54 | 0.05 |
| 1.541 | 0.05 |
| 1.542 | 0.051 |
| 1.543 | 0.051 |
| 1.544 | 0.051 |
| 1.545 | 0.051 |
| 1.546 | 0.051 |
| 1.547 | 0.051 |
| 1.548 | 0.051 |
| 1.549 | 0.051 |
| 1.55 | 0.051 |
| 1.551 | 0.051 |
| 1.552 | 0.051 |
| 1.553 | 0.051 |
| 1.554 | 0.051 |
| 1.555 | 0.051 |
| 1.556 | 0.051 |
| 1.557 | 0.051 |
| 1.558 | 0.051 |
| 1.559 | 0.05 |
| 1.56 | 0.05 |
| 1.561 | 0.05 |
| 1.562 | 0.05 |
| 1.563 | 0.05 |
| 1.564 | 0.05 |
| 1.565 | 0.049 |
| 1.566 | 0.049 |
| 1.567 | 0.049 |
| 1.568 | 0.049 |
| 1.569 | 0.048 |
| 1.57 | 0.048 |
| 1.571 | 0.048 |
| 1.572 | 0.048 |
| 1.573 | 0.047 |
| 1.574 | 0.047 |
| 1.575 | 0.047 |
| 1.576 | 0.047 |
| 1.577 | 0.046 |
| 1.578 | 0.046 |
| 1.579 | 0.045 |
| 1.58 | 0.045 |
| 1.581 | 0.044 |
| 1.582 | 0.044 |
| 1.583 | 0.043 |
| 1.584 | 0.043 |
| 1.585 | 0.042 |
| 1.586 | 0.042 |
| 1.587 | 0.041 |
| 1.588 | 0.04 |
| 1.589 | 0.04 |
| 1.59 | 0.039 |
| 1.591 | 0.039 |
| 1.592 | 0.038 |
| 1.593 | 0.038 |
| 1.594 | 0.038 |
| 1.595 | 0.037 |
| 1.596 | 0.037 |
| 1.597 | 0.036 |
| 1.598 | 0.036 |
| 1.599 | 0.036 |
| 1.6 | 0.035 |
| 1.601 | 0.035 |
| 1.602 | 0.034 |
| 1.603 | 0.034 |
| 1.604 | 0.034 |
| 1.605 | 0.033 |
| 1.606 | 0.033 |
| 1.607 | 0.033 |
| 1.608 | 0.033 |
| 1.609 | 0.032 |
| 1.61 | 0.032 |
| 1.611 | 0.032 |
| 1.612 | 0.032 |
| 1.613 | 0.032 |
| 1.614 | 0.032 |
| 1.615 | 0.032 |
| 1.616 | 0.031 |
| 1.617 | 0.031 |
| 1.618 | 0.031 |
| 1.619 | 0.031 |
| 1.62 | 0.031 |
| 1.621 | 0.031 |
| 1.622 | 0.031 |
| 1.623 | 0.031 |
| 1.624 | 0.031 |
| 1.625 | 0.031 |
| 1.626 | 0.031 |
| 1.627 | 0.032 |
| 1.628 | 0.032 |
| 1.629 | 0.032 |
| 1.63 | 0.032 |
| 1.631 | 0.032 |
| 1.632 | 0.032 |
| 1.633 | 0.032 |
| 1.634 | 0.033 |
| 1.635 | 0.033 |
| 1.636 | 0.033 |
| 1.637 | 0.033 |
| 1.638 | 0.034 |
| 1.639 | 0.034 |
| 1.64 | 0.034 |
| 1.641 | 0.034 |
| 1.642 | 0.035 |
| 1.643 | 0.035 |
| 1.644 | 0.035 |
| 1.645 | 0.036 |
| 1.646 | 0.036 |
| 1.647 | 0.036 |
| 1.648 | 0.037 |
| 1.649 | 0.037 |
| 1.65 | 0.038 |
| 1.651 | 0.038 |
| 1.652 | 0.038 |
| 1.653 | 0.039 |
| 1.654 | 0.039 |
| 1.655 | 0.039 |
| 1.656 | 0.04 |
| 1.657 | 0.04 |
| 1.658 | 0.041 |
| 1.659 | 0.041 |
| 1.66 | 0.041 |
| 1.661 | 0.042 |
| 1.662 | 0.042 |
| 1.663 | 0.042 |
| 1.664 | 0.043 |
| 1.665 | 0.043 |
| 1.666 | 0.043 |
| 1.667 | 0.044 |
| 1.668 | 0.044 |
| 1.669 | 0.044 |
| 1.67 | 0.044 |
| 1.671 | 0.045 |
| 1.672 | 0.045 |
| 1.673 | 0.045 |
| 1.674 | 0.045 |
| 1.675 | 0.045 |
| 1.676 | 0.045 |
| 1.677 | 0.046 |
| 1.678 | 0.046 |
| 1.679 | 0.046 |
| 1.68 | 0.046 |
| 1.681 | 0.046 |
| 1.682 | 0.046 |
| 1.683 | 0.046 |
| 1.684 | 0.046 |
| 1.685 | 0.046 |
| 1.686 | 0.047 |
| 1.687 | 0.047 |
| 1.688 | 0.047 |
| 1.689 | 0.047 |
| 1.69 | 0.047 |
| 1.691 | 0.047 |
| 1.692 | 0.047 |
| 1.693 | 0.047 |
| 1.694 | 0.048 |
| 1.695 | 0.048 |
| 1.696 | 0.048 |
| 1.697 | 0.048 |
| 1.698 | 0.048 |
| 1.699 | 0.048 |
| 1.7 | 0.048 |
| 1.701 | 0.048 |
| 1.702 | 0.048 |
| 1.703 | 0.048 |
| 1.704 | 0.048 |
| 1.705 | 0.048 |
| 1.706 | 0.048 |
| 1.707 | 0.048 |
| 1.708 | 0.048 |
| 1.709 | 0.047 |
| 1.71 | 0.047 |
| 1.711 | 0.047 |
| 1.712 | 0.047 |
| 1.713 | 0.047 |
| 1.714 | 0.046 |
| 1.715 | 0.046 |
| 1.716 | 0.046 |
| 1.717 | 0.045 |
| 1.718 | 0.045 |
| 1.719 | 0.045 |
| 1.72 | 0.044 |
| 1.721 | 0.044 |
| 1.722 | 0.043 |
| 1.723 | 0.043 |
| 1.724 | 0.043 |
| 1.725 | 0.042 |
| 1.726 | 0.042 |
| 1.727 | 0.041 |
| 1.728 | 0.041 |
| 1.729 | 0.04 |
| 1.73 | 0.04 |
| 1.731 | 0.039 |
| 1.732 | 0.039 |
| 1.733 | 0.039 |
| 1.734 | 0.038 |
| 1.735 | 0.038 |
| 1.736 | 0.037 |
| 1.737 | 0.037 |
| 1.738 | 0.036 |
| 1.739 | 0.036 |
| 1.74 | 0.035 |
| 1.741 | 0.035 |
| 1.742 | 0.034 |
| 1.743 | 0.034 |
| 1.744 | 0.033 |
| 1.745 | 0.033 |
| 1.746 | 0.032 |
| 1.747 | 0.032 |
| 1.748 | 0.031 |
| 1.749 | 0.03 |
| 1.75 | 0.03 |
| 1.751 | 0.029 |
| 1.752 | 0.029 |
| 1.753 | 0.028 |
| 1.754 | 0.028 |
| 1.755 | 0.027 |
| 1.756 | 0.027 |
| 1.757 | 0.027 |
| 1.758 | 0.026 |
| 1.759 | 0.026 |
| 1.76 | 0.025 |
| 1.761 | 0.025 |
| 1.762 | 0.025 |
| 1.763 | 0.024 |
| 1.764 | 0.024 |
| 1.765 | 0.024 |
| 1.766 | 0.023 |
| 1.767 | 0.023 |
| 1.768 | 0.022 |
| 1.769 | 0.022 |
| 1.77 | 0.022 |
| 1.771 | 0.021 |
| 1.772 | 0.021 |
| 1.773 | 0.021 |
| 1.774 | 0.02 |
| 1.775 | 0.02 |
| 1.776 | 0.019 |
| 1.777 | 0.019 |
| 1.778 | 0.019 |
| 1.779 | 0.018 |
| 1.78 | 0.018 |
| 1.781 | 0.017 |
| 1.782 | 0.017 |
| 1.783 | 0.017 |
| 1.784 | 0.016 |
| 1.785 | 0.016 |
| 1.786 | 0.016 |
| 1.787 | 0.015 |
| 1.788 | 0.015 |
| 1.789 | 0.014 |
| 1.79 | 0.014 |
| 1.791 | 0.013 |
| 1.792 | 0.013 |
| 1.793 | 0.012 |
| 1.794 | 0.012 |
| 1.795 | 0.012 |
| 1.796 | 0.011 |
| 1.797 | 0.011 |
| 1.798 | 0.01 |
| 1.799 | 0.01 |
| 1.8 | 0.009 |
| 1.801 | 0.009 |
| 1.802 | 0.008 |
| 1.803 | 0.008 |
| 1.804 | 0.007 |
| 1.805 | 0.007 |
| 1.806 | 0.006 |
| 1.807 | 0.006 |
| 1.808 | 0.006 |
| 1.809 | 0.005 |
| 1.81 | 0.005 |
| 1.811 | 0.004 |
| 1.812 | 0.004 |
| 1.813 | 0.004 |
| 1.814 | 0.003 |
| 1.815 | 0.003 |
| 1.816 | 0.003 |
| 1.817 | 0.003 |
| 1.818 | 0.002 |
| 1.819 | 0.002 |
| 1.82 | 0.002 |
| 1.821 | 0.002 |
| 1.822 | 0.001 |
| 1.823 | 0.001 |
| 1.824 | 0.001 |
| 1.825 | 0.001 |
| 1.826 | 0.001 |
| 1.827 | 0.001 |
| 1.828 | 0.001 |
| 1.829 | 0.001 |
| 1.83 | 0.001 |
| 1.831 | 0.001 |
| 1.832 | 0.001 |
| 1.833 | 0.001 |
| 1.834 | 0.001 |
| 1.835 | 0.001 |
| 1.836 | 0.002 |
| 1.837 | 0.002 |
| 1.838 | 0.002 |
| 1.839 | 0.002 |
| 1.84 | 0.003 |
| 1.841 | 0.003 |
| 1.842 | 0.003 |
| 1.843 | 0.004 |
| 1.844 | 0.004 |
| 1.845 | 0.005 |
| 1.846 | 0.005 |
| 1.847 | 0.006 |
| 1.848 | 0.006 |
| 1.849 | 0.007 |
| 1.85 | 0.007 |
| 1.851 | 0.008 |
| 1.852 | 0.009 |
| 1.853 | 0.009 |
| 1.854 | 0.01 |
| 1.855 | 0.011 |
| 1.856 | 0.012 |
| 1.857 | 0.012 |
| 1.858 | 0.013 |
| 1.859 | 0.014 |
| 1.86 | 0.015 |
| 1.861 | 0.016 |
| 1.862 | 0.016 |
| 1.863 | 0.017 |
| 1.864 | 0.018 |
| 1.865 | 0.019 |
| 1.866 | 0.02 |
| 1.867 | 0.021 |
| 1.868 | 0.022 |
| 1.869 | 0.023 |
| 1.87 | 0.023 |
| 1.871 | 0.024 |
| 1.872 | 0.025 |
| 1.873 | 0.026 |
| 1.874 | 0.027 |
| 1.875 | 0.028 |
| 1.876 | 0.028 |
| 1.877 | 0.029 |
| 1.878 | 0.03 |
| 1.879 | 0.031 |
| 1.88 | 0.031 |
| 1.881 | 0.032 |
| 1.882 | 0.033 |
| 1.883 | 0.034 |
| 1.884 | 0.034 |
| 1.885 | 0.035 |
| 1.886 | 0.036 |
| 1.887 | 0.036 |
| 1.888 | 0.037 |
| 1.889 | 0.037 |
| 1.89 | 0.038 |
| 1.891 | 0.038 |
| 1.892 | 0.039 |
| 1.893 | 0.039 |
| 1.894 | 0.04 |
| 1.895 | 0.04 |
| 1.896 | 0.041 |
| 1.897 | 0.041 |
| 1.898 | 0.041 |
| 1.899 | 0.042 |
| 1.9 | 0.042 |
| 1.901 | 0.043 |
| 1.902 | 0.043 |
| 1.903 | 0.043 |
| 1.904 | 0.044 |
| 1.905 | 0.044 |
| 1.906 | 0.044 |
| 1.907 | 0.045 |
| 1.908 | 0.045 |
| 1.909 | 0.045 |
| 1.91 | 0.046 |
| 1.911 | 0.046 |
| 1.912 | 0.046 |
| 1.913 | 0.046 |
| 1.914 | 0.046 |
| 1.915 | 0.046 |
| 1.916 | 0.046 |
| 1.917 | 0.046 |
| 1.918 | 0.046 |
| 1.919 | 0.046 |
| 1.92 | 0.046 |
| 1.921 | 0.045 |
| 1.922 | 0.045 |
| 1.923 | 0.045 |
| 1.924 | 0.045 |
| 1.925 | 0.044 |
| 1.926 | 0.044 |
| 1.927 | 0.044 |
| 1.928 | 0.044 |
| 1.929 | 0.043 |
| 1.93 | 0.043 |
| 1.931 | 0.043 |
| 1.932 | 0.042 |
| 1.933 | 0.042 |
| 1.934 | 0.041 |
| 1.935 | 0.041 |
| 1.936 | 0.04 |
| 1.937 | 0.04 |
| 1.938 | 0.039 |
| 1.939 | 0.039 |
| 1.94 | 0.038 |
| 1.941 | 0.038 |
| 1.942 | 0.037 |
| 1.943 | 0.037 |
| 1.944 | 0.036 |
| 1.945 | 0.036 |
| 1.946 | 0.035 |
| 1.947 | 0.034 |
| 1.948 | 0.034 |
| 1.949 | 0.033 |
| 1.95 | 0.033 |
| 1.951 | 0.032 |
| 1.952 | 0.032 |
| 1.953 | 0.031 |
| 1.954 | 0.031 |
| 1.955 | 0.031 |
| 1.956 | 0.03 |
| 1.957 | 0.03 |
| 1.958 | 0.03 |
| 1.959 | 0.029 |
| 1.96 | 0.029 |
| 1.961 | 0.029 |
| 1.962 | 0.028 |
| 1.963 | 0.028 |
| 1.964 | 0.028 |
| 1.965 | 0.028 |
| 1.966 | 0.027 |
| 1.967 | 0.027 |
| 1.968 | 0.027 |
| 1.969 | 0.027 |
| 1.97 | 0.027 |
| 1.971 | 0.027 |
| 1.972 | 0.026 |
| 1.973 | 0.026 |
| 1.974 | 0.026 |
| 1.975 | 0.026 |
| 1.976 | 0.026 |
| 1.977 | 0.026 |
| 1.978 | 0.026 |
| 1.979 | 0.026 |
| 1.98 | 0.026 |
| 1.981 | 0.026 |
| 1.982 | 0.026 |
| 1.983 | 0.026 |
| 1.984 | 0.026 |
| 1.985 | 0.026 |
| 1.986 | 0.026 |
| 1.987 | 0.026 |
| 1.988 | 0.026 |
| 1.989 | 0.026 |
| 1.99 | 0.027 |
| 1.991 | 0.027 |
| 1.992 | 0.027 |
| 1.993 | 0.027 |
| 1.994 | 0.027 |
| 1.995 | 0.027 |
| 1.996 | 0.028 |
| 1.997 | 0.028 |
| 1.998 | 0.028 |
| 1.999 | 0.029 |
| 2.0 | 0.029 |
| 2.001 | 0.029 |
| 2.002 | 0.03 |
| 2.003 | 0.03 |
| 2.004 | 0.03 |
| 2.005 | 0.031 |
| 2.006 | 0.031 |
| 2.007 | 0.031 |
| 2.008 | 0.032 |
| 2.009 | 0.032 |
| 2.01 | 0.032 |
| 2.011 | 0.033 |
| 2.012 | 0.033 |
| 2.013 | 0.033 |
| 2.014 | 0.034 |
| 2.015 | 0.034 |
| 2.016 | 0.034 |
| 2.017 | 0.035 |
| 2.018 | 0.035 |
| 2.019 | 0.036 |
| 2.02 | 0.036 |
| 2.021 | 0.036 |
| 2.022 | 0.037 |
| 2.023 | 0.037 |
| 2.024 | 0.037 |
| 2.025 | 0.038 |
| 2.026 | 0.038 |
| 2.027 | 0.039 |
| 2.028 | 0.039 |
| 2.029 | 0.039 |
| 2.03 | 0.04 |
| 2.031 | 0.04 |
| 2.032 | 0.04 |
| 2.033 | 0.041 |
| 2.034 | 0.041 |
| 2.035 | 0.041 |
| 2.036 | 0.041 |
| 2.037 | 0.042 |
| 2.038 | 0.042 |
| 2.039 | 0.042 |
| 2.04 | 0.042 |
| 2.041 | 0.042 |
| 2.042 | 0.042 |
| 2.043 | 0.042 |
| 2.044 | 0.042 |
| 2.045 | 0.042 |
| 2.046 | 0.041 |
| 2.047 | 0.041 |
| 2.048 | 0.041 |
| 2.049 | 0.04 |
| 2.05 | 0.04 |
| 2.051 | 0.039 |
| 2.052 | 0.039 |
| 2.053 | 0.038 |
| 2.054 | 0.038 |
| 2.055 | 0.037 |
| 2.056 | 0.036 |
| 2.057 | 0.036 |
| 2.058 | 0.035 |
| 2.059 | 0.034 |
| 2.06 | 0.034 |
| 2.061 | 0.033 |
| 2.062 | 0.032 |
| 2.063 | 0.032 |
| 2.064 | 0.031 |
| 2.065 | 0.03 |
| 2.066 | 0.029 |
| 2.067 | 0.028 |
| 2.068 | 0.028 |
| 2.069 | 0.027 |
| 2.07 | 0.026 |
| 2.071 | 0.025 |
| 2.072 | 0.024 |
| 2.073 | 0.023 |
| 2.074 | 0.021 |
| 2.075 | 0.02 |
| 2.076 | 0.019 |
| 2.077 | 0.018 |
| 2.078 | 0.016 |
| 2.079 | 0.015 |
| 2.08 | 0.013 |
| 2.081 | 0.012 |
| 2.082 | 0.01 |
| 2.083 | 0.009 |
| 2.084 | 0.007 |
| 2.085 | 0.005 |
| 2.086 | 0.004 |
| 2.087 | 0.002 |
| 2.088 | 0 |
| 2.089 | -0.001 |
| 2.09 | -0.003 |
| 2.091 | -0.005 |
| 2.092 | -0.006 |
| 2.093 | -0.008 |
| 2.094 | -0.009 |
| 2.095 | -0.011 |
| 2.096 | -0.013 |
| 2.097 | -0.014 |
| 2.098 | -0.015 |
| 2.099 | -0.017 |
| 2.1 | -0.018 |
| 2.101 | -0.019 |
| 2.102 | -0.021 |
| 2.103 | -0.022 |
| 2.104 | -0.023 |
| 2.105 | -0.024 |
| 2.106 | -0.025 |
| 2.107 | -0.026 |
| 2.108 | -0.026 |
| 2.109 | -0.027 |
| 2.11 | -0.027 |
| 2.111 | -0.028 |
| 2.112 | -0.028 |
| 2.113 | -0.028 |
| 2.114 | -0.028 |
| 2.115 | -0.028 |
| 2.116 | -0.027 |
| 2.117 | -0.027 |
| 2.118 | -0.026 |
| 2.119 | -0.026 |
| 2.12 | -0.025 |
| 2.121 | -0.024 |
| 2.122 | -0.023 |
| 2.123 | -0.022 |
| 2.124 | -0.02 |
| 2.125 | -0.019 |
| 2.126 | -0.017 |
| 2.127 | -0.016 |
| 2.128 | -0.014 |
| 2.129 | -0.012 |
| 2.13 | -0.01 |
| 2.131 | -0.008 |
| 2.132 | -0.006 |
| 2.133 | -0.004 |
| 2.134 | -0.002 |
| 2.135 | 0 |
| 2.136 | 0.002 |
| 2.137 | 0.005 |
| 2.138 | 0.007 |
| 2.139 | 0.009 |
| 2.14 | 0.012 |
| 2.141 | 0.014 |
| 2.142 | 0.016 |
| 2.143 | 0.019 |
| 2.144 | 0.021 |
| 2.145 | 0.023 |
| 2.146 | 0.025 |
| 2.147 | 0.027 |
| 2.148 | 0.029 |
| 2.149 | 0.031 |
| 2.15 | 0.033 |
| 2.151 | 0.035 |
| 2.152 | 0.037 |
| 2.153 | 0.039 |
| 2.154 | 0.04 |
| 2.155 | 0.042 |
| 2.156 | 0.043 |
| 2.157 | 0.045 |
| 2.158 | 0.046 |
| 2.159 | 0.047 |
| 2.16 | 0.048 |
| 2.161 | 0.049 |
| 2.162 | 0.05 |
| 2.163 | 0.051 |
| 2.164 | 0.052 |
| 2.165 | 0.053 |
| 2.166 | 0.053 |
| 2.167 | 0.054 |
| 2.168 | 0.054 |
| 2.169 | 0.055 |
| 2.17 | 0.055 |
| 2.171 | 0.055 |
| 2.172 | 0.056 |
| 2.173 | 0.056 |
| 2.174 | 0.056 |
| 2.175 | 0.056 |
| 2.176 | 0.056 |
| 2.177 | 0.056 |
| 2.178 | 0.056 |
| 2.179 | 0.056 |
| 2.18 | 0.056 |
| 2.181 | 0.055 |
| 2.182 | 0.055 |
| 2.183 | 0.055 |
| 2.184 | 0.055 |
| 2.185 | 0.054 |
| 2.186 | 0.054 |
| 2.187 | 0.054 |
| 2.188 | 0.053 |
| 2.189 | 0.053 |
| 2.19 | 0.053 |
| 2.191 | 0.052 |
| 2.192 | 0.052 |
| 2.193 | 0.051 |
| 2.194 | 0.051 |
| 2.195 | 0.051 |
| 2.196 | 0.05 |
| 2.197 | 0.05 |
| 2.198 | 0.05 |
| 2.199 | 0.049 |
| 2.2 | 0.049 |
| 2.201 | 0.049 |
| 2.202 | 0.048 |
| 2.203 | 0.048 |
| 2.204 | 0.047 |
| 2.205 | 0.047 |
| 2.206 | 0.047 |
| 2.207 | 0.046 |
| 2.208 | 0.046 |
| 2.209 | 0.046 |
| 2.21 | 0.045 |
| 2.211 | 0.045 |
| 2.212 | 0.045 |
| 2.213 | 0.045 |
| 2.214 | 0.044 |
| 2.215 | 0.044 |
| 2.216 | 0.044 |
| 2.217 | 0.043 |
| 2.218 | 0.043 |
| 2.219 | 0.043 |
| 2.22 | 0.043 |
| 2.221 | 0.043 |
| 2.222 | 0.042 |
| 2.223 | 0.042 |
| 2.224 | 0.042 |
| 2.225 | 0.042 |
| 2.226 | 0.041 |
| 2.227 | 0.041 |
| 2.228 | 0.041 |
| 2.229 | 0.041 |
| 2.23 | 0.041 |
| 2.231 | 0.04 |
| 2.232 | 0.04 |
| 2.233 | 0.04 |
| 2.234 | 0.04 |
| 2.235 | 0.039 |
| 2.236 | 0.039 |
| 2.237 | 0.039 |
| 2.238 | 0.039 |
| 2.239 | 0.039 |
| 2.24 | 0.039 |
| 2.241 | 0.038 |
| 2.242 | 0.038 |
| 2.243 | 0.038 |
| 2.244 | 0.038 |
| 2.245 | 0.038 |
| 2.246 | 0.037 |
| 2.247 | 0.037 |
| 2.248 | 0.037 |
| 2.249 | 0.037 |
| 2.25 | 0.037 |
| 2.251 | 0.037 |
| 2.252 | 0.036 |
| 2.253 | 0.036 |
| 2.254 | 0.036 |
| 2.255 | 0.036 |
| 2.256 | 0.036 |
| 2.257 | 0.035 |
| 2.258 | 0.035 |
| 2.259 | 0.035 |
| 2.26 | 0.035 |
| 2.261 | 0.035 |
| 2.262 | 0.035 |
| 2.263 | 0.035 |
| 2.264 | 0.034 |
| 2.265 | 0.034 |
| 2.266 | 0.034 |
| 2.267 | 0.034 |
| 2.268 | 0.034 |
| 2.269 | 0.034 |
| 2.27 | 0.034 |
| 2.271 | 0.034 |
| 2.272 | 0.034 |
| 2.273 | 0.034 |
| 2.274 | 0.034 |
| 2.275 | 0.034 |
| 2.276 | 0.034 |
| 2.277 | 0.035 |
| 2.278 | 0.035 |
| 2.279 | 0.035 |
| 2.28 | 0.035 |
| 2.281 | 0.035 |
| 2.282 | 0.036 |
| 2.283 | 0.036 |
| 2.284 | 0.036 |
| 2.285 | 0.037 |
| 2.286 | 0.037 |
| 2.287 | 0.037 |
| 2.288 | 0.038 |
| 2.289 | 0.038 |
| 2.29 | 0.039 |
| 2.291 | 0.039 |
| 2.292 | 0.039 |
| 2.293 | 0.04 |
| 2.294 | 0.04 |
| 2.295 | 0.041 |
| 2.296 | 0.041 |
| 2.297 | 0.041 |
| 2.298 | 0.042 |
| 2.299 | 0.042 |
| 2.3 | 0.043 |
| 2.301 | 0.043 |
| 2.302 | 0.043 |
| 2.303 | 0.044 |
| 2.304 | 0.044 |
| 2.305 | 0.044 |
| 2.306 | 0.045 |
| 2.307 | 0.045 |
| 2.308 | 0.045 |
| 2.309 | 0.046 |
| 2.31 | 0.046 |
| 2.311 | 0.046 |
| 2.312 | 0.046 |
| 2.313 | 0.047 |
| 2.314 | 0.047 |
| 2.315 | 0.048 |
| 2.316 | 0.048 |
| 2.317 | 0.048 |
| 2.318 | 0.049 |
| 2.319 | 0.049 |
| 2.32 | 0.05 |
| 2.321 | 0.05 |
| 2.322 | 0.051 |
| 2.323 | 0.052 |
| 2.324 | 0.052 |
| 2.325 | 0.053 |
| 2.326 | 0.054 |
| 2.327 | 0.054 |
| 2.328 | 0.055 |
| 2.329 | 0.056 |
| 2.33 | 0.056 |
| 2.331 | 0.057 |
| 2.332 | 0.058 |
| 2.333 | 0.059 |
| 2.334 | 0.059 |
| 2.335 | 0.06 |
| 2.336 | 0.061 |
| 2.337 | 0.062 |
| 2.338 | 0.062 |
| 2.339 | 0.063 |
| 2.34 | 0.063 |
| 2.341 | 0.064 |
| 2.342 | 0.065 |
| 2.343 | 0.065 |
| 2.344 | 0.066 |
| 2.345 | 0.066 |
| 2.346 | 0.067 |
| 2.347 | 0.067 |
| 2.348 | 0.067 |
| 2.349 | 0.068 |
| 2.35 | 0.068 |
| 2.351 | 0.068 |
| 2.352 | 0.069 |
| 2.353 | 0.069 |
| 2.354 | 0.069 |
| 2.355 | 0.069 |
| 2.356 | 0.069 |
| 2.357 | 0.069 |
| 2.358 | 0.069 |
| 2.359 | 0.069 |
| 2.36 | 0.068 |
| 2.361 | 0.068 |
| 2.362 | 0.068 |
| 2.363 | 0.068 |
| 2.364 | 0.067 |
| 2.365 | 0.067 |
| 2.366 | 0.066 |
| 2.367 | 0.066 |
| 2.368 | 0.065 |
| 2.369 | 0.065 |
| 2.37 | 0.064 |
| 2.371 | 0.064 |
| 2.372 | 0.063 |
| 2.373 | 0.062 |
| 2.374 | 0.062 |
| 2.375 | 0.061 |
| 2.376 | 0.06 |
| 2.377 | 0.059 |
| 2.378 | 0.058 |
| 2.379 | 0.057 |
| 2.38 | 0.056 |
| 2.381 | 0.055 |
| 2.382 | 0.054 |
| 2.383 | 0.053 |
| 2.384 | 0.052 |
| 2.385 | 0.05 |
| 2.386 | 0.049 |
| 2.387 | 0.048 |
| 2.388 | 0.047 |
| 2.389 | 0.046 |
| 2.39 | 0.045 |
| 2.391 | 0.043 |
| 2.392 | 0.042 |
| 2.393 | 0.041 |
| 2.394 | 0.04 |
| 2.395 | 0.039 |
| 2.396 | 0.038 |
| 2.397 | 0.037 |
| 2.398 | 0.036 |
| 2.399 | 0.035 |
| 2.4 | 0.034 |
| 2.401 | 0.033 |
| 2.402 | 0.032 |
| 2.403 | 0.031 |
| 2.404 | 0.03 |
| 2.405 | 0.029 |
| 2.406 | 0.029 |
| 2.407 | 0.028 |
| 2.408 | 0.027 |
| 2.409 | 0.027 |
| 2.41 | 0.026 |
| 2.411 | 0.025 |
| 2.412 | 0.025 |
| 2.413 | 0.024 |
| 2.414 | 0.024 |
| 2.415 | 0.023 |
| 2.416 | 0.023 |
| 2.417 | 0.022 |
| 2.418 | 0.021 |
| 2.419 | 0.021 |
| 2.42 | 0.02 |
| 2.421 | 0.019 |
| 2.422 | 0.019 |
| 2.423 | 0.018 |
| 2.424 | 0.017 |
| 2.425 | 0.017 |
| 2.426 | 0.016 |
| 2.427 | 0.015 |
| 2.428 | 0.014 |
| 2.429 | 0.014 |
| 2.43 | 0.013 |
| 2.431 | 0.012 |
| 2.432 | 0.012 |
| 2.433 | 0.011 |
| 2.434 | 0.01 |
| 2.435 | 0.01 |
| 2.436 | 0.009 |
| 2.437 | 0.008 |
| 2.438 | 0.008 |
| 2.439 | 0.007 |
| 2.44 | 0.007 |
| 2.441 | 0.006 |
| 2.442 | 0.006 |
| 2.443 | 0.006 |
| 2.444 | 0.006 |
| 2.445 | 0.005 |
| 2.446 | 0.005 |
| 2.447 | 0.005 |
| 2.448 | 0.005 |
| 2.449 | 0.006 |
| 2.45 | 0.006 |
| 2.451 | 0.006 |
| 2.452 | 0.006 |
| 2.453 | 0.006 |
| 2.454 | 0.007 |
| 2.455 | 0.007 |
| 2.456 | 0.008 |
| 2.457 | 0.008 |
| 2.458 | 0.008 |
| 2.459 | 0.009 |
| 2.46 | 0.009 |
| 2.461 | 0.01 |
| 2.462 | 0.011 |
| 2.463 | 0.011 |
| 2.464 | 0.012 |
| 2.465 | 0.012 |
| 2.466 | 0.013 |
| 2.467 | 0.014 |
| 2.468 | 0.014 |
| 2.469 | 0.015 |
| 2.47 | 0.016 |
| 2.471 | 0.016 |
| 2.472 | 0.017 |
| 2.473 | 0.018 |
| 2.474 | 0.018 |
| 2.475 | 0.019 |
| 2.476 | 0.02 |
| 2.477 | 0.02 |
| 2.478 | 0.021 |
| 2.479 | 0.021 |
| 2.48 | 0.022 |
| 2.481 | 0.023 |
| 2.482 | 0.023 |
| 2.483 | 0.024 |
| 2.484 | 0.024 |
| 2.485 | 0.025 |
| 2.486 | 0.025 |
| 2.487 | 0.026 |
| 2.488 | 0.026 |
| 2.489 | 0.027 |
| 2.49 | 0.027 |
| 2.491 | 0.028 |
| 2.492 | 0.028 |
| 2.493 | 0.029 |
| 2.494 | 0.029 |
| 2.495 | 0.029 |
| 2.496 | 0.03 |
| 2.497 | 0.03 |
| 2.498 | 0.03 |
| 2.499 | 0.031 |
| 2.5 | 0.031 |
| 2.501 | 0.031 |
| 2.502 | 0.032 |
| 2.503 | 0.032 |
| 2.504 | 0.032 |
| 2.505 | 0.032 |
| 2.506 | 0.033 |
| 2.507 | 0.033 |
| 2.508 | 0.033 |
| 2.509 | 0.033 |
| 2.51 | 0.033 |
| 2.511 | 0.033 |
| 2.512 | 0.034 |
| 2.513 | 0.034 |
| 2.514 | 0.034 |
| 2.515 | 0.034 |
| 2.516 | 0.034 |
| 2.517 | 0.034 |
| 2.518 | 0.034 |
| 2.519 | 0.034 |
| 2.52 | 0.034 |
| 2.521 | 0.034 |
| 2.522 | 0.034 |
| 2.523 | 0.035 |
| 2.524 | 0.035 |
| 2.525 | 0.035 |
| 2.526 | 0.035 |
| 2.527 | 0.035 |
| 2.528 | 0.034 |
| 2.529 | 0.034 |
| 2.53 | 0.034 |
| 2.531 | 0.034 |
| 2.532 | 0.034 |
| 2.533 | 0.034 |
| 2.534 | 0.033 |
| 2.535 | 0.033 |
| 2.536 | 0.033 |
| 2.537 | 0.033 |
| 2.538 | 0.032 |
| 2.539 | 0.032 |
| 2.54 | 0.032 |
| 2.541 | 0.031 |
| 2.542 | 0.031 |
| 2.543 | 0.031 |
| 2.544 | 0.031 |
| 2.545 | 0.03 |
| 2.546 | 0.03 |
| 2.547 | 0.03 |
| 2.548 | 0.03 |
| 2.549 | 0.03 |
| 2.55 | 0.03 |
| 2.551 | 0.03 |
| 2.552 | 0.03 |
| 2.553 | 0.03 |
| 2.554 | 0.03 |
| 2.555 | 0.03 |
| 2.556 | 0.03 |
| 2.557 | 0.03 |
| 2.558 | 0.03 |
| 2.559 | 0.03 |
| 2.56 | 0.03 |
| 2.561 | 0.031 |
| 2.562 | 0.031 |
| 2.563 | 0.031 |
| 2.564 | 0.031 |
| 2.565 | 0.031 |
| 2.566 | 0.031 |
| 2.567 | 0.031 |
| 2.568 | 0.031 |
| 2.569 | 0.031 |
| 2.57 | 0.032 |
| 2.571 | 0.032 |
| 2.572 | 0.032 |
| 2.573 | 0.032 |
| 2.574 | 0.033 |
| 2.575 | 0.033 |
| 2.576 | 0.033 |
| 2.577 | 0.034 |
| 2.578 | 0.034 |
| 2.579 | 0.035 |
| 2.58 | 0.035 |
| 2.581 | 0.035 |
| 2.582 | 0.036 |
| 2.583 | 0.036 |
| 2.584 | 0.036 |
| 2.585 | 0.037 |
| 2.586 | 0.037 |
| 2.587 | 0.037 |
| 2.588 | 0.038 |
| 2.589 | 0.038 |
| 2.59 | 0.038 |
| 2.591 | 0.039 |
| 2.592 | 0.039 |
| 2.593 | 0.04 |
| 2.594 | 0.04 |
| 2.595 | 0.04 |
| 2.596 | 0.041 |
| 2.597 | 0.041 |
| 2.598 | 0.041 |
| 2.599 | 0.041 |
| 2.6 | 0.042 |
| 2.601 | 0.042 |
| 2.602 | 0.042 |
| 2.603 | 0.041 |
| 2.604 | 0.041 |
| 2.605 | 0.041 |
| 2.606 | 0.041 |
| 2.607 | 0.04 |
| 2.608 | 0.04 |
| 2.609 | 0.039 |
| 2.61 | 0.039 |
| 2.611 | 0.038 |
| 2.612 | 0.037 |
| 2.613 | 0.037 |
| 2.614 | 0.036 |
| 2.615 | 0.035 |
| 2.616 | 0.034 |
| 2.617 | 0.034 |
| 2.618 | 0.033 |
| 2.619 | 0.032 |
| 2.62 | 0.032 |
| 2.621 | 0.031 |
| 2.622 | 0.03 |
| 2.623 | 0.03 |
| 2.624 | 0.029 |
| 2.625 | 0.029 |
| 2.626 | 0.029 |
| 2.627 | 0.028 |
| 2.628 | 0.028 |
| 2.629 | 0.028 |
| 2.63 | 0.027 |
| 2.631 | 0.027 |
| 2.632 | 0.027 |
| 2.633 | 0.027 |
| 2.634 | 0.027 |
| 2.635 | 0.027 |
| 2.636 | 0.027 |
| 2.637 | 0.027 |
| 2.638 | 0.027 |
| 2.639 | 0.027 |
| 2.64 | 0.027 |
| 2.641 | 0.026 |
| 2.642 | 0.026 |
| 2.643 | 0.026 |
| 2.644 | 0.026 |
| 2.645 | 0.026 |
| 2.646 | 0.026 |
| 2.647 | 0.026 |
| 2.648 | 0.026 |
| 2.649 | 0.026 |
| 2.65 | 0.025 |
| 2.651 | 0.025 |
| 2.652 | 0.025 |
| 2.653 | 0.025 |
| 2.654 | 0.025 |
| 2.655 | 0.024 |
| 2.656 | 0.024 |
| 2.657 | 0.024 |
| 2.658 | 0.023 |
| 2.659 | 0.023 |
| 2.66 | 0.023 |
| 2.661 | 0.022 |
| 2.662 | 0.022 |
| 2.663 | 0.022 |
| 2.664 | 0.022 |
| 2.665 | 0.021 |
| 2.666 | 0.021 |
| 2.667 | 0.021 |
| 2.668 | 0.02 |
| 2.669 | 0.02 |
| 2.67 | 0.02 |
| 2.671 | 0.019 |
| 2.672 | 0.019 |
| 2.673 | 0.019 |
| 2.674 | 0.019 |
| 2.675 | 0.018 |
| 2.676 | 0.018 |
| 2.677 | 0.018 |
| 2.678 | 0.018 |
| 2.679 | 0.018 |
| 2.68 | 0.018 |
| 2.681 | 0.018 |
| 2.682 | 0.018 |
| 2.683 | 0.018 |
| 2.684 | 0.018 |
| 2.685 | 0.018 |
| 2.686 | 0.018 |
| 2.687 | 0.018 |
| 2.688 | 0.018 |
| 2.689 | 0.018 |
| 2.69 | 0.018 |
| 2.691 | 0.018 |
| 2.692 | 0.018 |
| 2.693 | 0.019 |
| 2.694 | 0.019 |
| 2.695 | 0.019 |
| 2.696 | 0.019 |
| 2.697 | 0.019 |
| 2.698 | 0.02 |
| 2.699 | 0.02 |
| 2.7 | 0.02 |
| 2.701 | 0.02 |
| 2.702 | 0.021 |
| 2.703 | 0.021 |
| 2.704 | 0.021 |
| 2.705 | 0.021 |
| 2.706 | 0.022 |
| 2.707 | 0.022 |
| 2.708 | 0.022 |
| 2.709 | 0.022 |
| 2.71 | 0.022 |
| 2.711 | 0.023 |
| 2.712 | 0.023 |
| 2.713 | 0.023 |
| 2.714 | 0.024 |
| 2.715 | 0.024 |
| 2.716 | 0.024 |
| 2.717 | 0.025 |
| 2.718 | 0.025 |
| 2.719 | 0.025 |
| 2.72 | 0.026 |
| 2.721 | 0.026 |
| 2.722 | 0.026 |
| 2.723 | 0.027 |
| 2.724 | 0.027 |
| 2.725 | 0.028 |
| 2.726 | 0.028 |
| 2.727 | 0.028 |
| 2.728 | 0.029 |
| 2.729 | 0.029 |
| 2.73 | 0.029 |
| 2.731 | 0.03 |
| 2.732 | 0.03 |
| 2.733 | 0.03 |
| 2.734 | 0.03 |
| 2.735 | 0.03 |
| 2.736 | 0.03 |
| 2.737 | 0.03 |
| 2.738 | 0.03 |
| 2.739 | 0.03 |
| 2.74 | 0.03 |
| 2.741 | 0.029 |
| 2.742 | 0.029 |
| 2.743 | 0.028 |
| 2.744 | 0.027 |
| 2.745 | 0.027 |
| 2.746 | 0.026 |
| 2.747 | 0.025 |
| 2.748 | 0.024 |
| 2.749 | 0.023 |
| 2.75 | 0.022 |
| 2.751 | 0.02 |
| 2.752 | 0.019 |
| 2.753 | 0.018 |
| 2.754 | 0.017 |
| 2.755 | 0.016 |
| 2.756 | 0.015 |
| 2.757 | 0.014 |
| 2.758 | 0.013 |
| 2.759 | 0.012 |
| 2.76 | 0.012 |
| 2.761 | 0.011 |
| 2.762 | 0.01 |
| 2.763 | 0.01 |
| 2.764 | 0.009 |
| 2.765 | 0.009 |
| 2.766 | 0.008 |
| 2.767 | 0.008 |
| 2.768 | 0.008 |
| 2.769 | 0.008 |
| 2.77 | 0.008 |
| 2.771 | 0.008 |
| 2.772 | 0.008 |
| 2.773 | 0.008 |
| 2.774 | 0.008 |
| 2.775 | 0.008 |
| 2.776 | 0.009 |
| 2.777 | 0.009 |
| 2.778 | 0.009 |
| 2.779 | 0.01 |
| 2.78 | 0.01 |
| 2.781 | 0.011 |
| 2.782 | 0.011 |
| 2.783 | 0.012 |
| 2.784 | 0.012 |
| 2.785 | 0.013 |
| 2.786 | 0.014 |
| 2.787 | 0.014 |
| 2.788 | 0.015 |
| 2.789 | 0.016 |
| 2.79 | 0.016 |
| 2.791 | 0.017 |
| 2.792 | 0.018 |
| 2.793 | 0.019 |
| 2.794 | 0.019 |
| 2.795 | 0.02 |
| 2.796 | 0.021 |
| 2.797 | 0.022 |
| 2.798 | 0.022 |
| 2.799 | 0.023 |
| 2.8 | 0.024 |
| 2.801 | 0.024 |
| 2.802 | 0.025 |
| 2.803 | 0.025 |
| 2.804 | 0.026 |
| 2.805 | 0.026 |
| 2.806 | 0.027 |
| 2.807 | 0.027 |
| 2.808 | 0.027 |
| 2.809 | 0.027 |
| 2.81 | 0.027 |
| 2.811 | 0.027 |
| 2.812 | 0.027 |
| 2.813 | 0.027 |
| 2.814 | 0.027 |
| 2.815 | 0.026 |
| 2.816 | 0.026 |
| 2.817 | 0.025 |
| 2.818 | 0.025 |
| 2.819 | 0.024 |
| 2.82 | 0.024 |
| 2.821 | 0.023 |
| 2.822 | 0.023 |
| 2.823 | 0.022 |
| 2.824 | 0.021 |
| 2.825 | 0.02 |
| 2.826 | 0.02 |
| 2.827 | 0.019 |
| 2.828 | 0.018 |
| 2.829 | 0.017 |
| 2.83 | 0.017 |
| 2.831 | 0.016 |
| 2.832 | 0.015 |
| 2.833 | 0.014 |
| 2.834 | 0.013 |
| 2.835 | 0.013 |
| 2.836 | 0.012 |
| 2.837 | 0.011 |
| 2.838 | 0.011 |
| 2.839 | 0.01 |
| 2.84 | 0.009 |
| 2.841 | 0.009 |
| 2.842 | 0.008 |
| 2.843 | 0.007 |
| 2.844 | 0.007 |
| 2.845 | 0.006 |
| 2.846 | 0.005 |
| 2.847 | 0.005 |
| 2.848 | 0.004 |
| 2.849 | 0.003 |
| 2.85 | 0.002 |
| 2.851 | 0.001 |
| 2.852 | 0 |
| 2.853 | -0.001 |
| 2.854 | -0.002 |
| 2.855 | -0.003 |
| 2.856 | -0.004 |
| 2.857 | -0.005 |
| 2.858 | -0.007 |
| 2.859 | -0.008 |
| 2.86 | -0.009 |
| 2.861 | -0.011 |
| 2.862 | -0.012 |
| 2.863 | -0.014 |
| 2.864 | -0.016 |
| 2.865 | -0.018 |
| 2.866 | -0.02 |
| 2.867 | -0.022 |
| 2.868 | -0.024 |
| 2.869 | -0.026 |
| 2.87 | -0.029 |
| 2.871 | -0.031 |
| 2.872 | -0.033 |
| 2.873 | -0.036 |
| 2.874 | -0.039 |
| 2.875 | -0.041 |
| 2.876 | -0.044 |
| 2.877 | -0.047 |
| 2.878 | -0.05 |
| 2.879 | -0.052 |
| 2.88 | -0.055 |
| 2.881 | -0.058 |
| 2.882 | -0.061 |
| 2.883 | -0.064 |
| 2.884 | -0.067 |
| 2.885 | -0.07 |
| 2.886 | -0.073 |
| 2.887 | -0.076 |
| 2.888 | -0.079 |
| 2.889 | -0.082 |
| 2.89 | -0.085 |
| 2.891 | -0.088 |
| 2.892 | -0.091 |
| 2.893 | -0.093 |
| 2.894 | -0.096 |
| 2.895 | -0.099 |
| 2.896 | -0.102 |
| 2.897 | -0.104 |
| 2.898 | -0.107 |
| 2.899 | -0.11 |
| 2.9 | -0.112 |
| 2.901 | -0.115 |
| 2.902 | -0.118 |
| 2.903 | -0.12 |
| 2.904 | -0.123 |
| 2.905 | -0.126 |
| 2.906 | -0.129 |
| 2.907 | -0.132 |
| 2.908 | -0.135 |
| 2.909 | -0.137 |
| 2.91 | -0.14 |
| 2.911 | -0.143 |
| 2.912 | -0.146 |
| 2.913 | -0.149 |
| 2.914 | -0.152 |
| 2.915 | -0.154 |
| 2.916 | -0.157 |
| 2.917 | -0.16 |
| 2.918 | -0.162 |
| 2.919 | -0.165 |
| 2.92 | -0.168 |
| 2.921 | -0.17 |
| 2.922 | -0.173 |
| 2.923 | -0.175 |
| 2.924 | -0.178 |
| 2.925 | -0.181 |
| 2.926 | -0.183 |
| 2.927 | -0.186 |
| 2.928 | -0.189 |
| 2.929 | -0.192 |
| 2.93 | -0.195 |
| 2.931 | -0.198 |
| 2.932 | -0.201 |
| 2.933 | -0.204 |
| 2.934 | -0.208 |
| 2.935 | -0.211 |
| 2.936 | -0.215 |
| 2.937 | -0.219 |
| 2.938 | -0.223 |
| 2.939 | -0.228 |
| 2.94 | -0.232 |
| 2.941 | -0.237 |
| 2.942 | -0.242 |
| 2.943 | -0.247 |
| 2.944 | -0.252 |
| 2.945 | -0.257 |
| 2.946 | -0.262 |
| 2.947 | -0.267 |
| 2.948 | -0.272 |
| 2.949 | -0.278 |
| 2.95 | -0.283 |
| 2.951 | -0.288 |
| 2.952 | -0.293 |
| 2.953 | -0.298 |
| 2.954 | -0.303 |
| 2.955 | -0.308 |
| 2.956 | -0.312 |
| 2.957 | -0.317 |
| 2.958 | -0.321 |
| 2.959 | -0.325 |
| 2.96 | -0.329 |
| 2.961 | -0.333 |
| 2.962 | -0.336 |
| 2.963 | -0.339 |
| 2.964 | -0.342 |
| 2.965 | -0.344 |
| 2.966 | -0.347 |
| 2.967 | -0.349 |
| 2.968 | -0.351 |
| 2.969 | -0.352 |
| 2.97 | -0.353 |
| 2.971 | -0.354 |
| 2.972 | -0.355 |
| 2.973 | -0.356 |
| 2.974 | -0.356 |
| 2.975 | -0.356 |
| 2.976 | -0.356 |
| 2.977 | -0.356 |
| 2.978 | -0.356 |
| 2.979 | -0.355 |
| 2.98 | -0.354 |
| 2.981 | -0.353 |
| 2.982 | -0.352 |
| 2.983 | -0.351 |
| 2.984 | -0.349 |
| 2.985 | -0.348 |
| 2.986 | -0.346 |
| 2.987 | -0.344 |
| 2.988 | -0.342 |
| 2.989 | -0.34 |
| 2.99 | -0.337 |
| 2.991 | -0.335 |
| 2.992 | -0.333 |
| 2.993 | -0.33 |
| 2.994 | -0.327 |
| 2.995 | -0.325 |
| 2.996 | -0.322 |
| 2.997 | -0.319 |
| 2.998 | -0.316 |
| 2.999 | -0.313 |